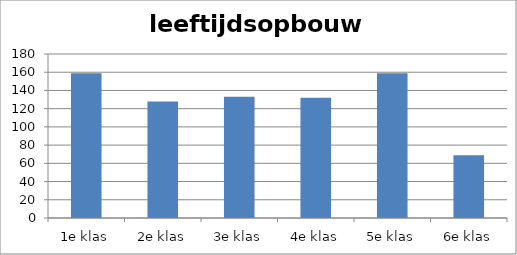
| Category | 14-15 |
|---|---|
| 1e klas | 159 |
| 2e klas | 128 |
| 3e klas | 133 |
| 4e klas | 132 |
| 5e klas | 159 |
| 6e klas | 69 |